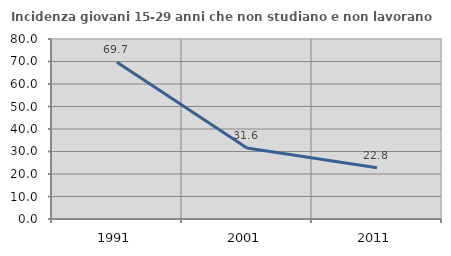
| Category | Incidenza giovani 15-29 anni che non studiano e non lavorano  |
|---|---|
| 1991.0 | 69.673 |
| 2001.0 | 31.556 |
| 2011.0 | 22.821 |